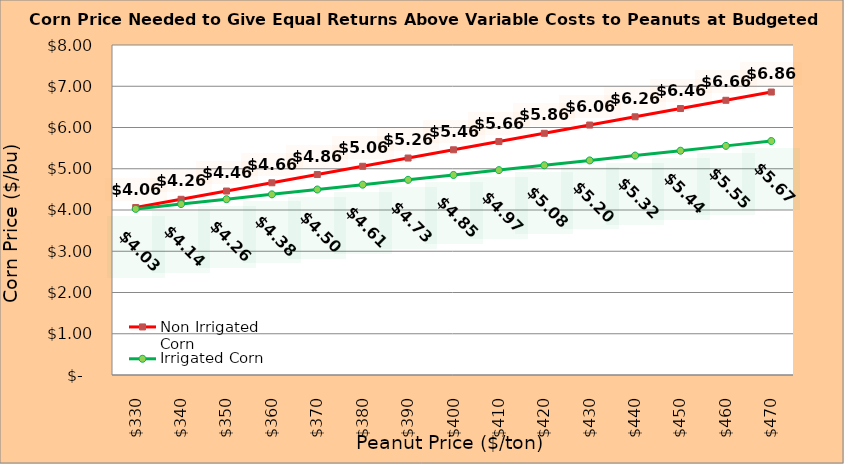
| Category | Non Irrigated Corn | Irrigated Corn |
|---|---|---|
| 330.0 | 4.06 | 4.027 |
| 340.0 | 4.26 | 4.144 |
| 350.0 | 4.46 | 4.262 |
| 360.0 | 4.66 | 4.379 |
| 370.0 | 4.86 | 4.497 |
| 380.0 | 5.06 | 4.614 |
| 390.0 | 5.26 | 4.732 |
| 400.0 | 5.46 | 4.849 |
| 410.0 | 5.66 | 4.967 |
| 420.0 | 5.86 | 5.084 |
| 430.0 | 6.06 | 5.202 |
| 440.0 | 6.26 | 5.319 |
| 450.0 | 6.46 | 5.437 |
| 460.0 | 6.66 | 5.554 |
| 470.0 | 6.86 | 5.672 |